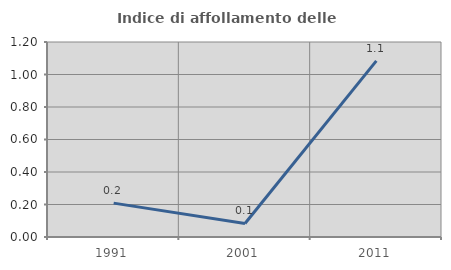
| Category | Indice di affollamento delle abitazioni  |
|---|---|
| 1991.0 | 0.209 |
| 2001.0 | 0.083 |
| 2011.0 | 1.084 |